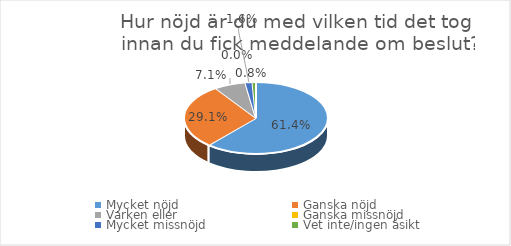
| Category | Series 0 |
|---|---|
| Mycket nöjd  | 0.614 |
| Ganska nöjd | 0.291 |
| Varken eller  | 0.071 |
| Ganska missnöjd | 0 |
| Mycket missnöjd  | 0.016 |
| Vet inte/ingen åsikt | 0.008 |